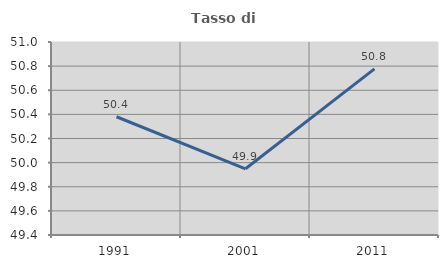
| Category | Tasso di occupazione   |
|---|---|
| 1991.0 | 50.38 |
| 2001.0 | 49.949 |
| 2011.0 | 50.777 |